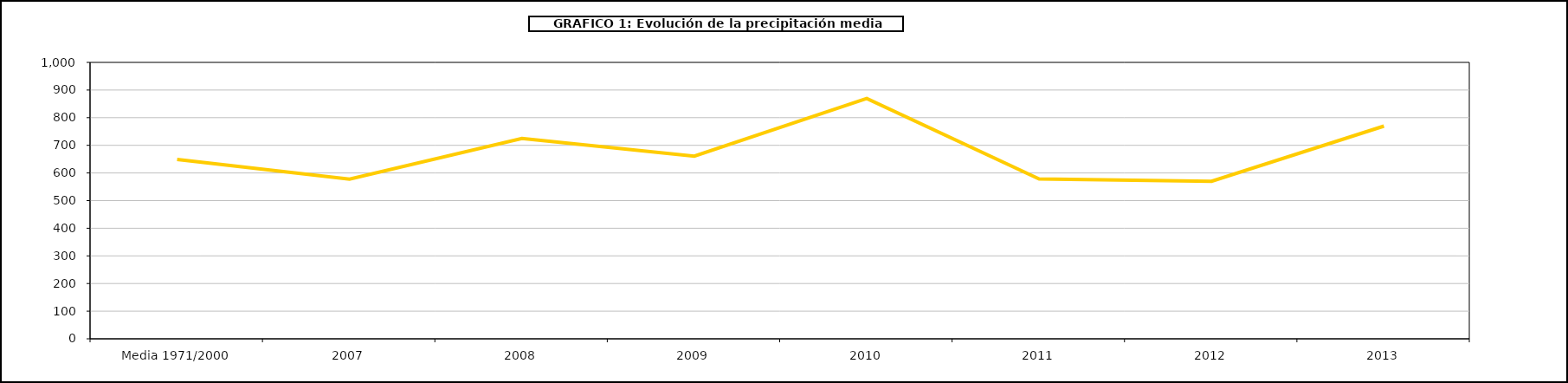
| Category | media |
|---|---|
| 0 | 649 |
| 1 | 578 |
| 2 | 725 |
| 3 | 661 |
| 4 | 869.377 |
| 5 | 578.444 |
| 6 | 570.1 |
| 7 | 769.551 |